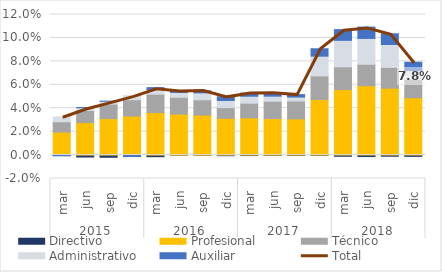
| Category | Directivo | Profesional | Técnico | Administrativo | Auxiliar |
|---|---|---|---|---|---|
| 0 | 0 | 0.019 | 0.009 | 0.004 | -0.001 |
| 1 | -0.002 | 0.028 | 0.01 | 0.002 | 0 |
| 2 | -0.002 | 0.031 | 0.012 | 0.002 | 0 |
| 3 | 0 | 0.033 | 0.014 | 0.003 | -0.001 |
| 4 | -0.001 | 0.036 | 0.016 | 0.004 | 0.002 |
| 5 | 0 | 0.035 | 0.014 | 0.004 | 0.001 |
| 6 | 0 | 0.034 | 0.013 | 0.006 | 0.002 |
| 7 | -0.001 | 0.031 | 0.009 | 0.006 | 0.003 |
| 8 | 0 | 0.032 | 0.013 | 0.006 | 0.003 |
| 9 | 0 | 0.031 | 0.015 | 0.004 | 0.003 |
| 10 | 0 | 0.031 | 0.015 | 0.003 | 0.002 |
| 11 | 0 | 0.047 | 0.02 | 0.017 | 0.006 |
| 12 | -0.001 | 0.056 | 0.019 | 0.023 | 0.009 |
| 13 | -0.001 | 0.059 | 0.018 | 0.022 | 0.01 |
| 14 | -0.001 | 0.057 | 0.018 | 0.02 | 0.009 |
| 15 | -0.001 | 0.049 | 0.016 | 0.008 | 0.007 |